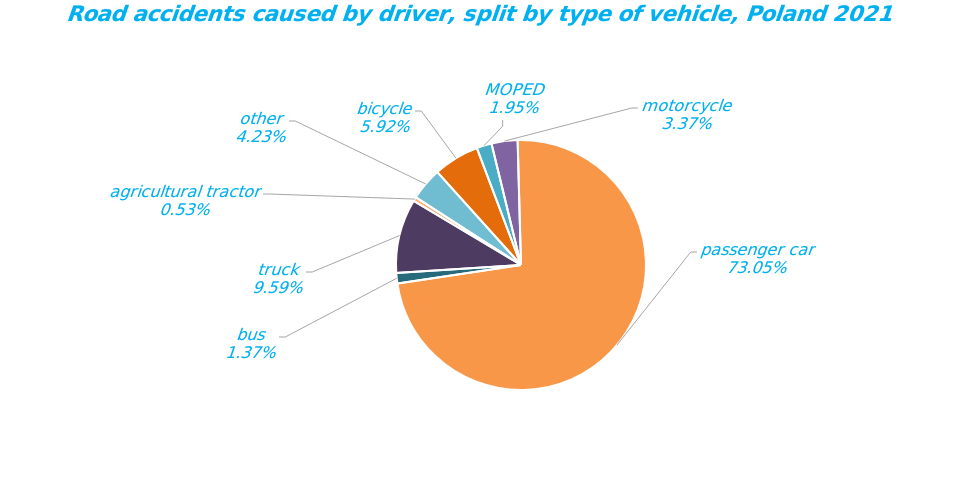
| Category | Series 0 |
|---|---|
| bicycle | 1221 |
| MOPED | 402 |
| motorcycle | 694 |
| passenger car | 15066 |
| bus | 282 |
| truck | 1977 |
| agricultural tractor | 109 |
| other | 872 |